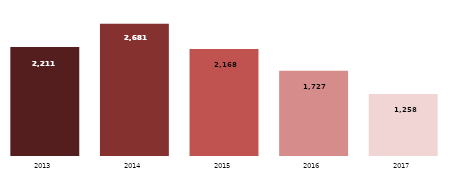
| Category | PASSAGEIROS TRANSPORTADOS (mil pessoas) |
|---|---|
| 2013.0 | 2211 |
| 2014.0 | 2681 |
| 2015.0 | 2168 |
| 2016.0 | 1727 |
| 2017.0 | 1258 |